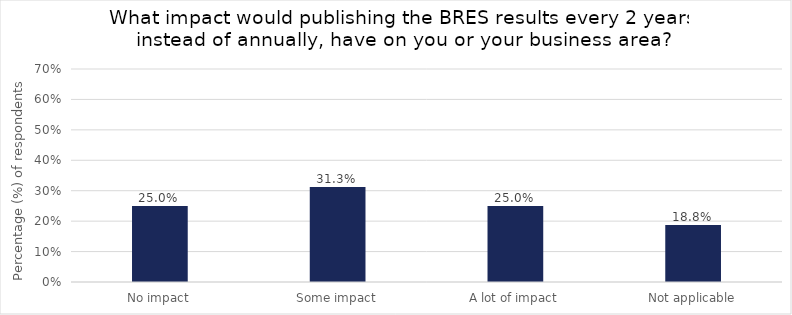
| Category | 12.5% |
|---|---|
| No impact | 0.25 |
| Some impact | 0.312 |
| A lot of impact | 0.25 |
| Not applicable | 0.188 |